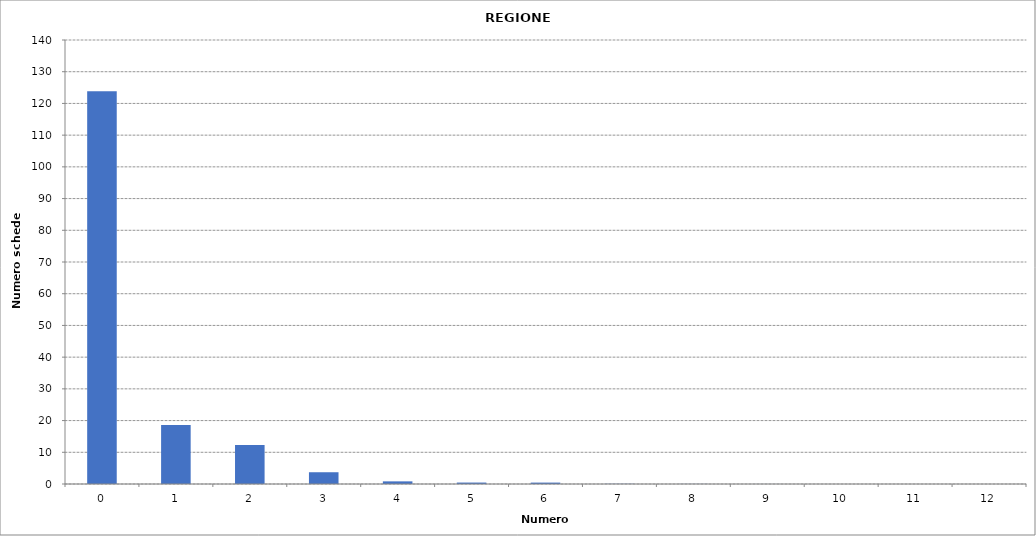
| Category | Series 0 |
|---|---|
| 0.0 | 123861 |
| 1.0 | 18643 |
| 2.0 | 12302 |
| 3.0 | 3709 |
| 4.0 | 830 |
| 5.0 | 453 |
| 6.0 | 442 |
| 7.0 | 59 |
| 8.0 | 30 |
| 9.0 | 11 |
| 10.0 | 4 |
| 11.0 | 7 |
| 12.0 | 2 |